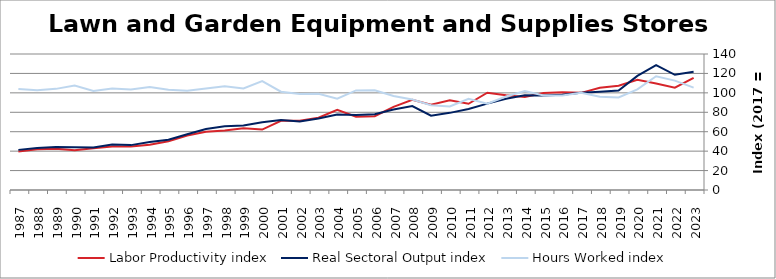
| Category | Labor Productivity index | Real Sectoral Output index | Hours Worked index |
|---|---|---|---|
| 2023.0 | 115.414 | 121.627 | 105.383 |
| 2022.0 | 105.373 | 118.623 | 112.575 |
| 2021.0 | 109.691 | 128.488 | 117.137 |
| 2020.0 | 113.365 | 117.51 | 103.656 |
| 2019.0 | 107.414 | 102.376 | 95.31 |
| 2018.0 | 105.185 | 101.039 | 96.058 |
| 2017.0 | 100 | 100 | 100 |
| 2016.0 | 100.697 | 98.062 | 97.383 |
| 2015.0 | 99.954 | 97.277 | 97.321 |
| 2014.0 | 95.67 | 97.413 | 101.822 |
| 2013.0 | 97.608 | 93.921 | 96.222 |
| 2012.0 | 100.133 | 88.883 | 88.765 |
| 2011.0 | 88.743 | 83.366 | 93.941 |
| 2010.0 | 92.292 | 79.409 | 86.042 |
| 2009.0 | 87.763 | 76.532 | 87.204 |
| 2008.0 | 92.755 | 86.469 | 93.223 |
| 2007.0 | 85.529 | 82.844 | 96.861 |
| 2006.0 | 76.001 | 78.06 | 102.709 |
| 2005.0 | 75.402 | 77.277 | 102.487 |
| 2004.0 | 82.581 | 77.68 | 94.066 |
| 2003.0 | 74.388 | 73.636 | 98.99 |
| 2002.0 | 71.252 | 70.43 | 98.847 |
| 2001.0 | 71.212 | 72.057 | 101.188 |
| 2000.0 | 62.209 | 69.749 | 112.121 |
| 1999.0 | 63.453 | 66.377 | 104.608 |
| 1998.0 | 61.289 | 65.503 | 106.876 |
| 1997.0 | 60.055 | 62.73 | 104.455 |
| 1996.0 | 56.058 | 57.342 | 102.29 |
| 1995.0 | 50.09 | 51.649 | 103.112 |
| 1994.0 | 46.638 | 49.392 | 105.906 |
| 1993.0 | 44.675 | 46.208 | 103.431 |
| 1992.0 | 44.751 | 46.775 | 104.522 |
| 1991.0 | 42.911 | 43.785 | 102.038 |
| 1990.0 | 40.953 | 44.016 | 107.478 |
| 1989.0 | 42.521 | 44.268 | 104.109 |
| 1988.0 | 42.001 | 43.113 | 102.649 |
| 1987.0 | 39.721 | 41.309 | 103.997 |